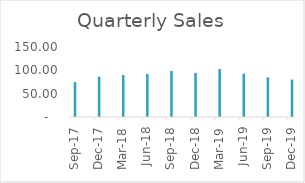
| Category | Sales |
|---|---|
| 2017-09-30 | 74.72 |
| 2017-12-31 | 86.25 |
| 2018-03-31 | 89.82 |
| 2018-06-30 | 92.03 |
| 2018-09-30 | 98.47 |
| 2018-12-31 | 94.48 |
| 2019-03-31 | 102.66 |
| 2019-06-30 | 93.18 |
| 2019-09-30 | 84.92 |
| 2019-12-31 | 80.11 |